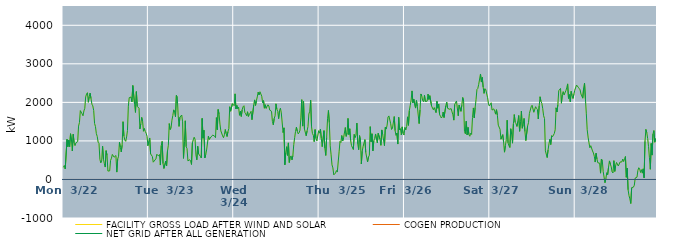
| Category | FACILITY GROSS LOAD AFTER WIND AND SOLAR | COGEN PRODUCTION | NET GRID AFTER ALL GENERATION |
|---|---|---|---|
|  Mon  3/22 | 315 | 0 | 315 |
|  Mon  3/22 | 362 | 0 | 362 |
|  Mon  3/22 | 271 | 0 | 271 |
|  Mon  3/22 | 271 | 0 | 271 |
|  Mon  3/22 | 1040 | 0 | 1040 |
|  Mon  3/22 | 850 | 0 | 850 |
|  Mon  3/22 | 1020 | 0 | 1020 |
|  Mon  3/22 | 852 | 0 | 852 |
|  Mon  3/22 | 1186 | 0 | 1186 |
|  Mon  3/22 | 1025 | 0 | 1025 |
|  Mon  3/22 | 738 | 0 | 738 |
|  Mon  3/22 | 1172 | 0 | 1172 |
|  Mon  3/22 | 951 | 0 | 951 |
|  Mon  3/22 | 878 | 0 | 878 |
|  Mon  3/22 | 949 | 0 | 949 |
|  Mon  3/22 | 936 | 0 | 936 |
|  Mon  3/22 | 982 | 0 | 982 |
|  Mon  3/22 | 1384 | 0 | 1384 |
|  Mon  3/22 | 1476 | 0 | 1476 |
|  Mon  3/22 | 1786 | 0 | 1786 |
|  Mon  3/22 | 1792 | 0 | 1792 |
|  Mon  3/22 | 1702 | 0 | 1702 |
|  Mon  3/22 | 1652 | 0 | 1652 |
|  Mon  3/22 | 1777 | 0 | 1777 |
|  Mon  3/22 | 1846 | 0 | 1846 |
|  Mon  3/22 | 2141 | 0 | 2141 |
|  Mon  3/22 | 2216 | 0 | 2216 |
|  Mon  3/22 | 2251 | 0 | 2251 |
|  Mon  3/22 | 2003 | 0 | 2003 |
|  Mon  3/22 | 2154 | 0 | 2154 |
|  Mon  3/22 | 2240 | 0 | 2240 |
|  Mon  3/22 | 2098 | 0 | 2098 |
|  Mon  3/22 | 1954 | 0 | 1954 |
|  Mon  3/22 | 1909 | 0 | 1909 |
|  Mon  3/22 | 1791 | 0 | 1791 |
|  Mon  3/22 | 1453 | 0 | 1453 |
|  Mon  3/22 | 1372 | 0 | 1372 |
|  Mon  3/22 | 1189 | 0 | 1189 |
|  Mon  3/22 | 1115 | 0 | 1115 |
|  Mon  3/22 | 968 | 0 | 968 |
|  Mon  3/22 | 932 | 0 | 932 |
|  Mon  3/22 | 523 | 0 | 523 |
|  Mon  3/22 | 429 | 0 | 429 |
|  Mon  3/22 | 477 | 0 | 477 |
|  Mon  3/22 | 865 | 0 | 865 |
|  Mon  3/22 | 525 | 0 | 525 |
|  Mon  3/22 | 411 | 0 | 411 |
|  Mon  3/22 | 322 | 0 | 322 |
|  Mon  3/22 | 747 | 0 | 747 |
|  Mon  3/22 | 631 | 0 | 631 |
|  Mon  3/22 | 218 | 0 | 218 |
|  Mon  3/22 | 219 | 0 | 219 |
|  Mon  3/22 | 223 | 0 | 223 |
|  Mon  3/22 | 494 | 0 | 494 |
|  Mon  3/22 | 552 | 0 | 552 |
|  Mon  3/22 | 649 | 0 | 649 |
|  Mon  3/22 | 636 | 0 | 636 |
|  Mon  3/22 | 578 | 0 | 578 |
|  Mon  3/22 | 592 | 0 | 592 |
|  Mon  3/22 | 620 | 0 | 620 |
|  Mon  3/22 | 191 | 0 | 191 |
|  Mon  3/22 | 529 | 0 | 529 |
|  Mon  3/22 | 602 | 0 | 602 |
|  Mon  3/22 | 964 | 0 | 964 |
|  Mon  3/22 | 835 | 0 | 835 |
|  Mon  3/22 | 714 | 0 | 714 |
|  Mon  3/22 | 887 | 0 | 887 |
|  Mon  3/22 | 1498 | 0 | 1498 |
|  Mon  3/22 | 1128 | 0 | 1128 |
|  Mon  3/22 | 1025 | 0 | 1025 |
|  Mon  3/22 | 990 | 0 | 990 |
|  Mon  3/22 | 1103 | 0 | 1103 |
|  Mon  3/22 | 1266 | 0 | 1266 |
|  Mon  3/22 | 1901 | 0 | 1901 |
|  Mon  3/22 | 2123 | 0 | 2123 |
|  Mon  3/22 | 2103 | 0 | 2103 |
|  Mon  3/22 | 2138 | 0 | 2138 |
|  Mon  3/22 | 2014 | 0 | 2014 |
|  Mon  3/22 | 2437 | 0 | 2437 |
|  Mon  3/22 | 2423 | 0 | 2423 |
|  Mon  3/22 | 1950 | 0 | 1950 |
|  Mon  3/22 | 1740 | 0 | 1740 |
|  Mon  3/22 | 2279 | 0 | 2279 |
|  Mon  3/22 | 1897 | 0 | 1897 |
|  Mon  3/22 | 1890 | 0 | 1890 |
|  Mon  3/22 | 1846 | 0 | 1846 |
|  Mon  3/22 | 1311 | 0 | 1311 |
|  Mon  3/22 | 1441 | 0 | 1441 |
|  Mon  3/22 | 1610 | 0 | 1610 |
|  Mon  3/22 | 1506 | 0 | 1506 |
|  Mon  3/22 | 1251 | 0 | 1251 |
|  Mon  3/22 | 1321 | 0 | 1321 |
|  Mon  3/22 | 1247 | 0 | 1247 |
|  Mon  3/22 | 1200 | 0 | 1200 |
|  Mon  3/22 | 1117 | 0 | 1117 |
|  Mon  3/22 | 876 | 0 | 876 |
|  Tue  3/23 | 987 | 0 | 987 |
|  Tue  3/23 | 1076 | 0 | 1076 |
|  Tue  3/23 | 664 | 0 | 664 |
|  Tue  3/23 | 676 | 0 | 676 |
|  Tue  3/23 | 595 | 0 | 595 |
|  Tue  3/23 | 448 | 0 | 448 |
|  Tue  3/23 | 427 | 0 | 427 |
|  Tue  3/23 | 507 | 0 | 507 |
|  Tue  3/23 | 533 | 0 | 533 |
|  Tue  3/23 | 654 | 0 | 654 |
|  Tue  3/23 | 671 | 0 | 671 |
|  Tue  3/23 | 607 | 0 | 607 |
|  Tue  3/23 | 647 | 0 | 647 |
|  Tue  3/23 | 374 | 0 | 374 |
|  Tue  3/23 | 875 | 0 | 875 |
|  Tue  3/23 | 985 | 0 | 985 |
|  Tue  3/23 | 412 | 0 | 412 |
|  Tue  3/23 | 285 | 0 | 285 |
|  Tue  3/23 | 307 | 0 | 307 |
|  Tue  3/23 | 472 | 0 | 472 |
|  Tue  3/23 | 351 | 0 | 351 |
|  Tue  3/23 | 735 | 0 | 735 |
|  Tue  3/23 | 888 | 0 | 888 |
|  Tue  3/23 | 1449 | 0 | 1449 |
|  Tue  3/23 | 1293 | 0 | 1293 |
|  Tue  3/23 | 1334 | 0 | 1334 |
|  Tue  3/23 | 1537 | 0 | 1537 |
|  Tue  3/23 | 1657 | 0 | 1657 |
|  Tue  3/23 | 1805 | 0 | 1805 |
|  Tue  3/23 | 1740 | 0 | 1740 |
|  Tue  3/23 | 1623 | 0 | 1623 |
|  Tue  3/23 | 2183 | 0 | 2183 |
|  Tue  3/23 | 2150 | 0 | 2150 |
|  Tue  3/23 | 1668 | 0 | 1668 |
|  Tue  3/23 | 1377 | 0 | 1377 |
|  Tue  3/23 | 1616 | 0 | 1616 |
|  Tue  3/23 | 1635 | 0 | 1635 |
|  Tue  3/23 | 1672 | 0 | 1672 |
|  Tue  3/23 | 1494 | 0 | 1494 |
|  Tue  3/23 | 547 | 0 | 547 |
|  Tue  3/23 | 985 | 0 | 985 |
|  Tue  3/23 | 1522 | 0 | 1522 |
|  Tue  3/23 | 852 | 0 | 852 |
|  Tue  3/23 | 800 | 0 | 800 |
|  Tue  3/23 | 481 | 0 | 481 |
|  Tue  3/23 | 476 | 0 | 476 |
|  Tue  3/23 | 511 | 0 | 511 |
|  Tue  3/23 | 481 | 0 | 481 |
|  Tue  3/23 | 389 | 0 | 389 |
|  Tue  3/23 | 947 | 0 | 947 |
|  Tue  3/23 | 1027 | 0 | 1027 |
|  Tue  3/23 | 1095 | 0 | 1095 |
|  Tue  3/23 | 1042 | 0 | 1042 |
|  Tue  3/23 | 637 | 0 | 637 |
|  Tue  3/23 | 509 | 0 | 509 |
|  Tue  3/23 | 861 | 0 | 861 |
|  Tue  3/23 | 661 | 0 | 661 |
|  Tue  3/23 | 668 | 0 | 668 |
|  Tue  3/23 | 600 | 0 | 600 |
|  Tue  3/23 | 557 | 0 | 557 |
|  Tue  3/23 | 1584 | 0 | 1584 |
|  Tue  3/23 | 1071 | 0 | 1071 |
|  Tue  3/23 | 1276 | 0 | 1276 |
|  Tue  3/23 | 559 | 0 | 559 |
|  Tue  3/23 | 642 | 0 | 642 |
|  Tue  3/23 | 765 | 0 | 765 |
|  Tue  3/23 | 773 | 0 | 773 |
|  Tue  3/23 | 1123 | 0 | 1123 |
|  Tue  3/23 | 1038 | 0 | 1038 |
|  Tue  3/23 | 1014 | 0 | 1014 |
|  Tue  3/23 | 1106 | 0 | 1106 |
|  Tue  3/23 | 1114 | 0 | 1114 |
|  Tue  3/23 | 1151 | 0 | 1151 |
|  Tue  3/23 | 1158 | 0 | 1158 |
|  Tue  3/23 | 1123 | 0 | 1123 |
|  Tue  3/23 | 1084 | 0 | 1084 |
|  Tue  3/23 | 1604 | 0 | 1604 |
|  Tue  3/23 | 1290 | 0 | 1290 |
|  Tue  3/23 | 1815 | 0 | 1815 |
|  Tue  3/23 | 1700 | 0 | 1700 |
|  Tue  3/23 | 1437 | 0 | 1437 |
|  Tue  3/23 | 1261 | 0 | 1261 |
|  Tue  3/23 | 1240 | 0 | 1240 |
|  Tue  3/23 | 1132 | 0 | 1132 |
|  Tue  3/23 | 1084 | 0 | 1084 |
|  Tue  3/23 | 1160 | 0 | 1160 |
|  Tue  3/23 | 1295 | 0 | 1295 |
|  Tue  3/23 | 1189 | 0 | 1189 |
|  Tue  3/23 | 1114 | 0 | 1114 |
|  Tue  3/23 | 1240 | 0 | 1240 |
|  Tue  3/23 | 1318 | 0 | 1318 |
|  Tue  3/23 | 1886 | 0 | 1886 |
|  Tue  3/23 | 1771 | 0 | 1771 |
|  Tue  3/23 | 1782 | 0 | 1782 |
|  Tue  3/23 | 1966 | 0 | 1966 |
|  Tue  3/23 | 1945 | 0 | 1945 |
|  Wed  3/24 | 1913 | 0 | 1913 |
|  Wed  3/24 | 2221 | 0 | 2221 |
|  Wed  3/24 | 1828 | 0 | 1828 |
|  Wed  3/24 | 1920 | 0 | 1920 |
|  Wed  3/24 | 1835 | 0 | 1835 |
|  Wed  3/24 | 1875 | 0 | 1875 |
|  Wed  3/24 | 1665 | 0 | 1665 |
|  Wed  3/24 | 1766 | 0 | 1766 |
|  Wed  3/24 | 1635 | 0 | 1635 |
|  Wed  3/24 | 1809 | 0 | 1809 |
|  Wed  3/24 | 1886 | 0 | 1886 |
|  Wed  3/24 | 1912 | 0 | 1912 |
|  Wed  3/24 | 1737 | 0 | 1737 |
|  Wed  3/24 | 1703 | 0 | 1703 |
|  Wed  3/24 | 1652 | 0 | 1652 |
|  Wed  3/24 | 1756 | 0 | 1756 |
|  Wed  3/24 | 1634 | 0 | 1634 |
|  Wed  3/24 | 1681 | 0 | 1681 |
|  Wed  3/24 | 1671 | 0 | 1671 |
|  Wed  3/24 | 1767 | 0 | 1767 |
|  Wed  3/24 | 1550 | 0 | 1550 |
|  Wed  3/24 | 1539 | 0 | 1539 |
|  Wed  3/24 | 1932 | 0 | 1932 |
|  Wed  3/24 | 2064 | 0 | 2064 |
|  Wed  3/24 | 1921 | 0 | 1921 |
|  Wed  3/24 | 2044 | 0 | 2044 |
|  Wed  3/24 | 2142 | 0 | 2142 |
|  Wed  3/24 | 2263 | 0 | 2263 |
|  Wed  3/24 | 2192 | 0 | 2192 |
|  Wed  3/24 | 2275 | 0 | 2275 |
|  Wed  3/24 | 2289 | 0 | 2289 |
|  Wed  3/24 | 2159 | 0 | 2159 |
|  Wed  3/24 | 1990 | 0 | 1990 |
|  Wed  3/24 | 2046 | 0 | 2046 |
|  Wed  3/24 | 1849 | 0 | 1849 |
|  Wed  3/24 | 1937 | 0 | 1937 |
|  Wed  3/24 | 1845 | 0 | 1845 |
|  Wed  3/24 | 1892 | 0 | 1892 |
|  Wed  3/24 | 1937 | 0 | 1937 |
|  Wed  3/24 | 1906 | 0 | 1906 |
|  Wed  3/24 | 1799 | 0 | 1799 |
|  Wed  3/24 | 1774 | 0 | 1774 |
|  Wed  3/24 | 1768 | 0 | 1768 |
|  Wed  3/24 | 1505 | 0 | 1505 |
|  Wed  3/24 | 1418 | 0 | 1418 |
|  Wed  3/24 | 1583 | 0 | 1583 |
|  Wed  3/24 | 1652 | 0 | 1652 |
|  Wed  3/24 | 1962 | 0 | 1962 |
|  Wed  3/24 | 1823 | 0 | 1823 |
|  Wed  3/24 | 1764 | 0 | 1764 |
|  Wed  3/24 | 1577 | 0 | 1577 |
|  Wed  3/24 | 1785 | 0 | 1785 |
|  Wed  3/24 | 1849 | 0 | 1849 |
|  Wed  3/24 | 1726 | 0 | 1726 |
|  Wed  3/24 | 1713 | 0 | 1713 |
|  Wed  3/24 | 1217 | 0 | 1217 |
|  Wed  3/24 | 1339 | 0 | 1339 |
|  Wed  3/24 | 381 | 0 | 381 |
|  Wed  3/24 | 698 | 0 | 698 |
|  Wed  3/24 | 849 | 0 | 849 |
|  Wed  3/24 | 625 | 0 | 625 |
|  Wed  3/24 | 948 | 0 | 948 |
|  Wed  3/24 | 441 | 0 | 441 |
|  Wed  3/24 | 579 | 0 | 579 |
|  Wed  3/24 | 611 | 0 | 611 |
|  Wed  3/24 | 508 | 0 | 508 |
|  Wed  3/24 | 616 | 0 | 616 |
|  Wed  3/24 | 903 | 0 | 903 |
|  Wed  3/24 | 1082 | 0 | 1082 |
|  Wed  3/24 | 1247 | 0 | 1247 |
|  Wed  3/24 | 1356 | 0 | 1356 |
|  Wed  3/24 | 1249 | 0 | 1249 |
|  Wed  3/24 | 1183 | 0 | 1183 |
|  Wed  3/24 | 1210 | 0 | 1210 |
|  Wed  3/24 | 1279 | 0 | 1279 |
|  Wed  3/24 | 1596 | 0 | 1596 |
|  Wed  3/24 | 2070 | 0 | 2070 |
|  Wed  3/24 | 1384 | 0 | 1384 |
|  Wed  3/24 | 2025 | 0 | 2025 |
|  Wed  3/24 | 1311 | 0 | 1311 |
|  Wed  3/24 | 1287 | 0 | 1287 |
|  Wed  3/24 | 1134 | 0 | 1134 |
|  Wed  3/24 | 1261 | 0 | 1261 |
|  Wed  3/24 | 1371 | 0 | 1371 |
|  Wed  3/24 | 1697 | 0 | 1697 |
|  Wed  3/24 | 1770 | 0 | 1770 |
|  Wed  3/24 | 2055 | 0 | 2055 |
|  Wed  3/24 | 1369 | 0 | 1369 |
|  Wed  3/24 | 1193 | 0 | 1193 |
|  Wed  3/24 | 1148 | 0 | 1148 |
|  Wed  3/24 | 982 | 0 | 982 |
|  Wed  3/24 | 1294 | 0 | 1294 |
|  Wed  3/24 | 1065 | 0 | 1065 |
|  Wed  3/24 | 1002 | 0 | 1002 |
|  Wed  3/24 | 1027 | 0 | 1027 |
|  Wed  3/24 | 1264 | 0 | 1264 |
|  Thu  3/25 | 1201 | 0 | 1201 |
|  Thu  3/25 | 1304 | 0 | 1304 |
|  Thu  3/25 | 1062 | 0 | 1062 |
|  Thu  3/25 | 852 | 0 | 852 |
|  Thu  3/25 | 874 | 0 | 874 |
|  Thu  3/25 | 1266 | 0 | 1266 |
|  Thu  3/25 | 809 | 0 | 809 |
|  Thu  3/25 | 623 | 0 | 623 |
|  Thu  3/25 | 1089 | 0 | 1089 |
|  Thu  3/25 | 1574 | 0 | 1574 |
|  Thu  3/25 | 1789 | 0 | 1789 |
|  Thu  3/25 | 1474 | 0 | 1474 |
|  Thu  3/25 | 872 | 0 | 872 |
|  Thu  3/25 | 639 | 0 | 639 |
|  Thu  3/25 | 380 | 0 | 380 |
|  Thu  3/25 | 300 | 0 | 300 |
|  Thu  3/25 | 119 | 0 | 119 |
|  Thu  3/25 | 140 | 0 | 140 |
|  Thu  3/25 | 167 | 0 | 167 |
|  Thu  3/25 | 231 | 0 | 231 |
|  Thu  3/25 | 192 | 0 | 192 |
|  Thu  3/25 | 199 | 0 | 199 |
|  Thu  3/25 | 718 | 0 | 718 |
|  Thu  3/25 | 986 | 0 | 986 |
|  Thu  3/25 | 957 | 0 | 957 |
|  Thu  3/25 | 1139 | 0 | 1139 |
|  Thu  3/25 | 1001 | 0 | 1001 |
|  Thu  3/25 | 1079 | 0 | 1079 |
|  Thu  3/25 | 1095 | 0 | 1095 |
|  Thu  3/25 | 1346 | 0 | 1346 |
|  Thu  3/25 | 1119 | 0 | 1119 |
|  Thu  3/25 | 1202 | 0 | 1202 |
|  Thu  3/25 | 1584 | 0 | 1584 |
|  Thu  3/25 | 1165 | 0 | 1165 |
|  Thu  3/25 | 1315 | 0 | 1315 |
|  Thu  3/25 | 1009 | 0 | 1009 |
|  Thu  3/25 | 877 | 0 | 877 |
|  Thu  3/25 | 902 | 0 | 902 |
|  Thu  3/25 | 778 | 0 | 778 |
|  Thu  3/25 | 1167 | 0 | 1167 |
|  Thu  3/25 | 1088 | 0 | 1088 |
|  Thu  3/25 | 1152 | 0 | 1152 |
|  Thu  3/25 | 1463 | 0 | 1463 |
|  Thu  3/25 | 925 | 0 | 925 |
|  Thu  3/25 | 772 | 0 | 772 |
|  Thu  3/25 | 1136 | 0 | 1136 |
|  Thu  3/25 | 1025 | 0 | 1025 |
|  Thu  3/25 | 401 | 0 | 401 |
|  Thu  3/25 | 733 | 0 | 733 |
|  Thu  3/25 | 858 | 0 | 858 |
|  Thu  3/25 | 836 | 0 | 836 |
|  Thu  3/25 | 1034 | 0 | 1034 |
|  Thu  3/25 | 700 | 0 | 700 |
|  Thu  3/25 | 699 | 0 | 699 |
|  Thu  3/25 | 456 | 0 | 456 |
|  Thu  3/25 | 579 | 0 | 579 |
|  Thu  3/25 | 629 | 0 | 629 |
|  Thu  3/25 | 1370 | 0 | 1370 |
|  Thu  3/25 | 977 | 0 | 977 |
|  Thu  3/25 | 1185 | 0 | 1185 |
|  Thu  3/25 | 743 | 0 | 743 |
|  Thu  3/25 | 1001 | 0 | 1001 |
|  Thu  3/25 | 1068 | 0 | 1068 |
|  Thu  3/25 | 1180 | 0 | 1180 |
|  Thu  3/25 | 1050 | 0 | 1050 |
|  Thu  3/25 | 948 | 0 | 948 |
|  Thu  3/25 | 1197 | 0 | 1197 |
|  Thu  3/25 | 1199 | 0 | 1199 |
|  Thu  3/25 | 1040 | 0 | 1040 |
|  Thu  3/25 | 886 | 0 | 886 |
|  Thu  3/25 | 1285 | 0 | 1285 |
|  Thu  3/25 | 1165 | 0 | 1165 |
|  Thu  3/25 | 1162 | 0 | 1162 |
|  Thu  3/25 | 878 | 0 | 878 |
|  Thu  3/25 | 1355 | 0 | 1355 |
|  Thu  3/25 | 1307 | 0 | 1307 |
|  Thu  3/25 | 1410 | 0 | 1410 |
|  Thu  3/25 | 1619 | 0 | 1619 |
|  Thu  3/25 | 1648 | 0 | 1648 |
|  Thu  3/25 | 1654 | 0 | 1654 |
|  Thu  3/25 | 1444 | 0 | 1444 |
|  Thu  3/25 | 1296 | 0 | 1296 |
|  Thu  3/25 | 1324 | 0 | 1324 |
|  Thu  3/25 | 1316 | 0 | 1316 |
|  Thu  3/25 | 1631 | 0 | 1631 |
|  Thu  3/25 | 1267 | 0 | 1267 |
|  Thu  3/25 | 1143 | 0 | 1143 |
|  Thu  3/25 | 1205 | 0 | 1205 |
|  Thu  3/25 | 919 | 0 | 919 |
|  Thu  3/25 | 1611 | 0 | 1611 |
|  Thu  3/25 | 1285 | 0 | 1285 |
|  Thu  3/25 | 1319 | 0 | 1319 |
|  Thu  3/25 | 1156 | 0 | 1156 |
|  Thu  3/25 | 1364 | 0 | 1364 |
|  Thu  3/25 | 1194 | 0 | 1194 |
|  Thu  3/25 | 1152 | 0 | 1152 |
|  Fri  3/26 | 1348 | 0 | 1348 |
|  Fri  3/26 | 1287 | 0 | 1287 |
|  Fri  3/26 | 1376 | 0 | 1376 |
|  Fri  3/26 | 1624 | 0 | 1624 |
|  Fri  3/26 | 1405 | 0 | 1405 |
|  Fri  3/26 | 1788 | 0 | 1788 |
|  Fri  3/26 | 1920 | 0 | 1920 |
|  Fri  3/26 | 2060 | 0 | 2060 |
|  Fri  3/26 | 2297 | 0 | 2297 |
|  Fri  3/26 | 1989 | 0 | 1989 |
|  Fri  3/26 | 2084 | 0 | 2084 |
|  Fri  3/26 | 2108 | 0 | 2108 |
|  Fri  3/26 | 1852 | 0 | 1852 |
|  Fri  3/26 | 2048 | 0 | 2048 |
|  Fri  3/26 | 1892 | 0 | 1892 |
|  Fri  3/26 | 1868 | 0 | 1868 |
|  Fri  3/26 | 1450 | 0 | 1450 |
|  Fri  3/26 | 1804 | 0 | 1804 |
|  Fri  3/26 | 2218 | 0 | 2218 |
|  Fri  3/26 | 2163 | 0 | 2163 |
|  Fri  3/26 | 2043 | 0 | 2043 |
|  Fri  3/26 | 2017 | 0 | 2017 |
|  Fri  3/26 | 2182 | 0 | 2182 |
|  Fri  3/26 | 2023 | 0 | 2023 |
|  Fri  3/26 | 2011 | 0 | 2011 |
|  Fri  3/26 | 2031 | 0 | 2031 |
|  Fri  3/26 | 2214 | 0 | 2214 |
|  Fri  3/26 | 2075 | 0 | 2075 |
|  Fri  3/26 | 2173 | 0 | 2173 |
|  Fri  3/26 | 2184 | 0 | 2184 |
|  Fri  3/26 | 1903 | 0 | 1903 |
|  Fri  3/26 | 1882 | 0 | 1882 |
|  Fri  3/26 | 1808 | 0 | 1808 |
|  Fri  3/26 | 1864 | 0 | 1864 |
|  Fri  3/26 | 1881 | 0 | 1881 |
|  Fri  3/26 | 1735 | 0 | 1735 |
|  Fri  3/26 | 2027 | 0 | 2027 |
|  Fri  3/26 | 1848 | 0 | 1848 |
|  Fri  3/26 | 1955 | 0 | 1955 |
|  Fri  3/26 | 1685 | 0 | 1685 |
|  Fri  3/26 | 1638 | 0 | 1638 |
|  Fri  3/26 | 1594 | 0 | 1594 |
|  Fri  3/26 | 1632 | 0 | 1632 |
|  Fri  3/26 | 1748 | 0 | 1748 |
|  Fri  3/26 | 1607 | 0 | 1607 |
|  Fri  3/26 | 1613 | 0 | 1613 |
|  Fri  3/26 | 1910 | 0 | 1910 |
|  Fri  3/26 | 2003 | 0 | 2003 |
|  Fri  3/26 | 1848 | 0 | 1848 |
|  Fri  3/26 | 1828 | 0 | 1828 |
|  Fri  3/26 | 1822 | 0 | 1822 |
|  Fri  3/26 | 1840 | 0 | 1840 |
|  Fri  3/26 | 1836 | 0 | 1836 |
|  Fri  3/26 | 1753 | 0 | 1753 |
|  Fri  3/26 | 1677 | 0 | 1677 |
|  Fri  3/26 | 1539 | 0 | 1539 |
|  Fri  3/26 | 1945 | 0 | 1945 |
|  Fri  3/26 | 1937 | 0 | 1937 |
|  Fri  3/26 | 2036 | 0 | 2036 |
|  Fri  3/26 | 2012 | 0 | 2012 |
|  Fri  3/26 | 1653 | 0 | 1653 |
|  Fri  3/26 | 1928 | 0 | 1928 |
|  Fri  3/26 | 1904 | 0 | 1904 |
|  Fri  3/26 | 1769 | 0 | 1769 |
|  Fri  3/26 | 1924 | 0 | 1924 |
|  Fri  3/26 | 2126 | 0 | 2126 |
|  Fri  3/26 | 2037 | 0 | 2037 |
|  Fri  3/26 | 1245 | 0 | 1245 |
|  Fri  3/26 | 1188 | 0 | 1188 |
|  Fri  3/26 | 1510 | 0 | 1510 |
|  Fri  3/26 | 1157 | 0 | 1157 |
|  Fri  3/26 | 1350 | 0 | 1350 |
|  Fri  3/26 | 1163 | 0 | 1163 |
|  Fri  3/26 | 1121 | 0 | 1121 |
|  Fri  3/26 | 1200 | 0 | 1200 |
|  Fri  3/26 | 1168 | 0 | 1168 |
|  Fri  3/26 | 1606 | 0 | 1606 |
|  Fri  3/26 | 1855 | 0 | 1855 |
|  Fri  3/26 | 1597 | 0 | 1597 |
|  Fri  3/26 | 1867 | 0 | 1867 |
|  Fri  3/26 | 2074 | 0 | 2074 |
|  Fri  3/26 | 2333 | 0 | 2333 |
|  Fri  3/26 | 2361 | 0 | 2361 |
|  Fri  3/26 | 2468 | 0 | 2468 |
|  Fri  3/26 | 2451 | 0 | 2451 |
|  Fri  3/26 | 2736 | 0 | 2736 |
|  Fri  3/26 | 2527 | 0 | 2527 |
|  Fri  3/26 | 2648 | 0 | 2648 |
|  Fri  3/26 | 2395 | 0 | 2395 |
|  Fri  3/26 | 2234 | 0 | 2234 |
|  Fri  3/26 | 2353 | 0 | 2353 |
|  Fri  3/26 | 2327 | 0 | 2327 |
|  Fri  3/26 | 2328 | 0 | 2328 |
|  Fri  3/26 | 2119 | 0 | 2119 |
|  Fri  3/26 | 1959 | 0 | 1959 |
|  Fri  3/26 | 1905 | 0 | 1905 |
|  Sat  3/27 | 1906 | 0 | 1906 |
|  Sat  3/27 | 1989 | 0 | 1989 |
|  Sat  3/27 | 1800 | 0 | 1800 |
|  Sat  3/27 | 1777 | 0 | 1777 |
|  Sat  3/27 | 1831 | 0 | 1831 |
|  Sat  3/27 | 1768 | 0 | 1768 |
|  Sat  3/27 | 1695 | 0 | 1695 |
|  Sat  3/27 | 1809 | 0 | 1809 |
|  Sat  3/27 | 1664 | 0 | 1664 |
|  Sat  3/27 | 1409 | 0 | 1409 |
|  Sat  3/27 | 1421 | 0 | 1421 |
|  Sat  3/27 | 1301 | 0 | 1301 |
|  Sat  3/27 | 1045 | 0 | 1045 |
|  Sat  3/27 | 1021 | 0 | 1021 |
|  Sat  3/27 | 1161 | 0 | 1161 |
|  Sat  3/27 | 976 | 0 | 976 |
|  Sat  3/27 | 708 | 0 | 708 |
|  Sat  3/27 | 874 | 0 | 874 |
|  Sat  3/27 | 1030 | 0 | 1030 |
|  Sat  3/27 | 1536 | 0 | 1536 |
|  Sat  3/27 | 948 | 0 | 948 |
|  Sat  3/27 | 875 | 0 | 875 |
|  Sat  3/27 | 830 | 0 | 830 |
|  Sat  3/27 | 1315 | 0 | 1315 |
|  Sat  3/27 | 1179 | 0 | 1179 |
|  Sat  3/27 | 941 | 0 | 941 |
|  Sat  3/27 | 1444 | 0 | 1444 |
|  Sat  3/27 | 1683 | 0 | 1683 |
|  Sat  3/27 | 1483 | 0 | 1483 |
|  Sat  3/27 | 1444 | 0 | 1444 |
|  Sat  3/27 | 1376 | 0 | 1376 |
|  Sat  3/27 | 1508 | 0 | 1508 |
|  Sat  3/27 | 1659 | 0 | 1659 |
|  Sat  3/27 | 1250 | 0 | 1250 |
|  Sat  3/27 | 1499 | 0 | 1499 |
|  Sat  3/27 | 1774 | 0 | 1774 |
|  Sat  3/27 | 1329 | 0 | 1329 |
|  Sat  3/27 | 1426 | 0 | 1426 |
|  Sat  3/27 | 1583 | 0 | 1583 |
|  Sat  3/27 | 1243 | 0 | 1243 |
|  Sat  3/27 | 1011 | 0 | 1011 |
|  Sat  3/27 | 987 | 0 | 987 |
|  Sat  3/27 | 1390 | 0 | 1390 |
|  Sat  3/27 | 1474 | 0 | 1474 |
|  Sat  3/27 | 1711 | 0 | 1711 |
|  Sat  3/27 | 1709 | 0 | 1709 |
|  Sat  3/27 | 1885 | 0 | 1885 |
|  Sat  3/27 | 1924 | 0 | 1924 |
|  Sat  3/27 | 1913 | 0 | 1913 |
|  Sat  3/27 | 1743 | 0 | 1743 |
|  Sat  3/27 | 1747 | 0 | 1747 |
|  Sat  3/27 | 1887 | 0 | 1887 |
|  Sat  3/27 | 1845 | 0 | 1845 |
|  Sat  3/27 | 1816 | 0 | 1816 |
|  Sat  3/27 | 1569 | 0 | 1569 |
|  Sat  3/27 | 1905 | 0 | 1905 |
|  Sat  3/27 | 2145 | 0 | 2145 |
|  Sat  3/27 | 2024 | 0 | 2024 |
|  Sat  3/27 | 1974 | 0 | 1974 |
|  Sat  3/27 | 1834 | 0 | 1834 |
|  Sat  3/27 | 1652 | 0 | 1652 |
|  Sat  3/27 | 1581 | 0 | 1581 |
|  Sat  3/27 | 742 | 0 | 742 |
|  Sat  3/27 | 721 | 0 | 721 |
|  Sat  3/27 | 569 | 0 | 569 |
|  Sat  3/27 | 766 | 0 | 766 |
|  Sat  3/27 | 922 | 0 | 922 |
|  Sat  3/27 | 1044 | 0 | 1044 |
|  Sat  3/27 | 907 | 0 | 907 |
|  Sat  3/27 | 1135 | 0 | 1135 |
|  Sat  3/27 | 1108 | 0 | 1108 |
|  Sat  3/27 | 1102 | 0 | 1102 |
|  Sat  3/27 | 1191 | 0 | 1191 |
|  Sat  3/27 | 1289 | 0 | 1289 |
|  Sat  3/27 | 1859 | 0 | 1859 |
|  Sat  3/27 | 1750 | 0 | 1750 |
|  Sat  3/27 | 1938 | 0 | 1938 |
|  Sat  3/27 | 2301 | 0 | 2301 |
|  Sat  3/27 | 2287 | 0 | 2287 |
|  Sat  3/27 | 2362 | 0 | 2362 |
|  Sat  3/27 | 1978 | 0 | 1978 |
|  Sat  3/27 | 2198 | 0 | 2198 |
|  Sat  3/27 | 2280 | 0 | 2280 |
|  Sat  3/27 | 2190 | 0 | 2190 |
|  Sat  3/27 | 2184 | 0 | 2184 |
|  Sat  3/27 | 2302 | 0 | 2302 |
|  Sat  3/27 | 2374 | 0 | 2374 |
|  Sat  3/27 | 2479 | 0 | 2479 |
|  Sat  3/27 | 2102 | 0 | 2102 |
|  Sat  3/27 | 2201 | 0 | 2201 |
|  Sat  3/27 | 2018 | 0 | 2018 |
|  Sat  3/27 | 2285 | 0 | 2285 |
|  Sat  3/27 | 2175 | 0 | 2175 |
|  Sat  3/27 | 2102 | 0 | 2102 |
|  Sat  3/27 | 2208 | 0 | 2208 |
|  Sat  3/27 | 2313 | 0 | 2313 |
|  Sun  3/28 | 2331 | 0 | 2331 |
|  Sun  3/28 | 2449 | 0 | 2449 |
|  Sun  3/28 | 2443 | 0 | 2443 |
|  Sun  3/28 | 2391 | 0 | 2391 |
|  Sun  3/28 | 2359 | 0 | 2359 |
|  Sun  3/28 | 2326 | 0 | 2326 |
|  Sun  3/28 | 2216 | 0 | 2216 |
|  Sun  3/28 | 2219 | 0 | 2219 |
|  Sun  3/28 | 2109 | 0 | 2109 |
|  Sun  3/28 | 2367 | 0 | 2367 |
|  Sun  3/28 | 2499 | 0 | 2499 |
|  Sun  3/28 | 2090 | 0 | 2090 |
|  Sun  3/28 | 1720 | 0 | 1720 |
|  Sun  3/28 | 1291 | 0 | 1291 |
|  Sun  3/28 | 1099 | 0 | 1099 |
|  Sun  3/28 | 952 | 0 | 952 |
|  Sun  3/28 | 823 | 0 | 823 |
|  Sun  3/28 | 876 | 0 | 876 |
|  Sun  3/28 | 851 | 0 | 851 |
|  Sun  3/28 | 739 | 0 | 739 |
|  Sun  3/28 | 687 | 0 | 687 |
|  Sun  3/28 | 602 | 0 | 602 |
|  Sun  3/28 | 452 | 0 | 452 |
|  Sun  3/28 | 680 | 0 | 680 |
|  Sun  3/28 | 527 | 0 | 527 |
|  Sun  3/28 | 432 | 0 | 432 |
|  Sun  3/28 | 432 | 0 | 432 |
|  Sun  3/28 | 423 | 0 | 423 |
|  Sun  3/28 | 163 | 0 | 163 |
|  Sun  3/28 | 530 | 0 | 530 |
|  Sun  3/28 | 483 | 0 | 483 |
|  Sun  3/28 | 201 | 0 | 201 |
|  Sun  3/28 | 222 | 0 | 222 |
|  Sun  3/28 | -84 | 0 | -84 |
|  Sun  3/28 | 20 | 0 | 20 |
|  Sun  3/28 | 177 | 0 | 177 |
|  Sun  3/28 | 123 | 0 | 123 |
|  Sun  3/28 | 318 | 0 | 318 |
|  Sun  3/28 | 481 | 0 | 481 |
|  Sun  3/28 | 399 | 0 | 399 |
|  Sun  3/28 | 328 | 0 | 328 |
|  Sun  3/28 | 196 | 0 | 196 |
|  Sun  3/28 | 168 | 0 | 168 |
|  Sun  3/28 | 487 | 0 | 487 |
|  Sun  3/28 | 209 | 0 | 209 |
|  Sun  3/28 | 363 | 0 | 363 |
|  Sun  3/28 | 440 | 0 | 440 |
|  Sun  3/28 | 463 | 0 | 463 |
|  Sun  3/28 | 349 | 0 | 349 |
|  Sun  3/28 | 366 | 0 | 366 |
|  Sun  3/28 | 453 | 0 | 453 |
|  Sun  3/28 | 455 | 0 | 455 |
|  Sun  3/28 | 456 | 0 | 456 |
|  Sun  3/28 | 529 | 0 | 529 |
|  Sun  3/28 | 464 | 0 | 464 |
|  Sun  3/28 | 535 | 0 | 535 |
|  Sun  3/28 | 595 | 0 | 595 |
|  Sun  3/28 | 56 | 0 | 56 |
|  Sun  3/28 | 294 | 0 | 294 |
|  Sun  3/28 | -269 | 0 | -269 |
|  Sun  3/28 | -418 | 0 | -418 |
|  Sun  3/28 | -504 | 0 | -504 |
|  Sun  3/28 | -624 | 0 | -624 |
|  Sun  3/28 | -214 | 0 | -214 |
|  Sun  3/28 | -212 | 0 | -212 |
|  Sun  3/28 | -199 | 0 | -199 |
|  Sun  3/28 | -150 | 0 | -150 |
|  Sun  3/28 | 37 | 0 | 37 |
|  Sun  3/28 | 59 | 0 | 59 |
|  Sun  3/28 | 59 | 0 | 59 |
|  Sun  3/28 | 235 | 0 | 235 |
|  Sun  3/28 | 304 | 0 | 304 |
|  Sun  3/28 | 275 | 0 | 275 |
|  Sun  3/28 | 181 | 0 | 181 |
|  Sun  3/28 | 253 | 0 | 253 |
|  Sun  3/28 | 164 | 0 | 164 |
|  Sun  3/28 | 275 | 0 | 275 |
|  Sun  3/28 | 41 | 0 | 41 |
|  Sun  3/28 | 988 | 0 | 988 |
|  Sun  3/28 | 1298 | 0 | 1298 |
|  Sun  3/28 | 1215 | 0 | 1215 |
|  Sun  3/28 | 1063 | 0 | 1063 |
|  Sun  3/28 | 851 | 0 | 851 |
|  Sun  3/28 | 561 | 0 | 561 |
|  Sun  3/28 | 264 | 0 | 264 |
|  Sun  3/28 | 933 | 0 | 933 |
|  Sun  3/28 | 632 | 0 | 632 |
|  Sun  3/28 | 1177 | 0 | 1177 |
|  Sun  3/28 | 1268 | 0 | 1268 |
|  Sun  3/28 | 967 | 0 | 967 |
|  Sun  3/28 | 1063 | 0 | 1063 |
|  Sun  3/28 | 1088 | 0 | 1088 |